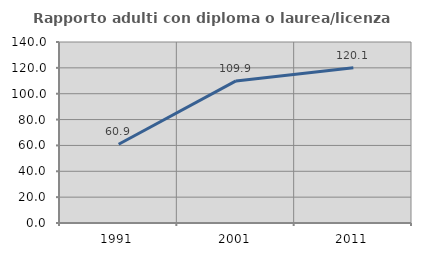
| Category | Rapporto adulti con diploma o laurea/licenza media  |
|---|---|
| 1991.0 | 60.925 |
| 2001.0 | 109.899 |
| 2011.0 | 120.102 |